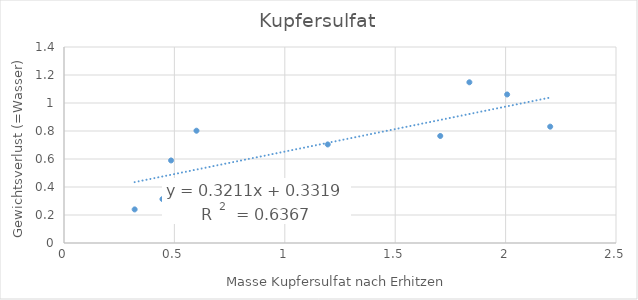
| Category | Series 0 |
|---|---|
| 0.6 | 0.802 |
| 0.4849 | 0.59 |
| 0.4459 | 0.314 |
| 1.1944 | 0.704 |
| 2.202 | 0.831 |
| 1.7041 | 0.764 |
| 0.32 | 0.24 |
| 1.836 | 1.148 |
| 2.007 | 1.061 |